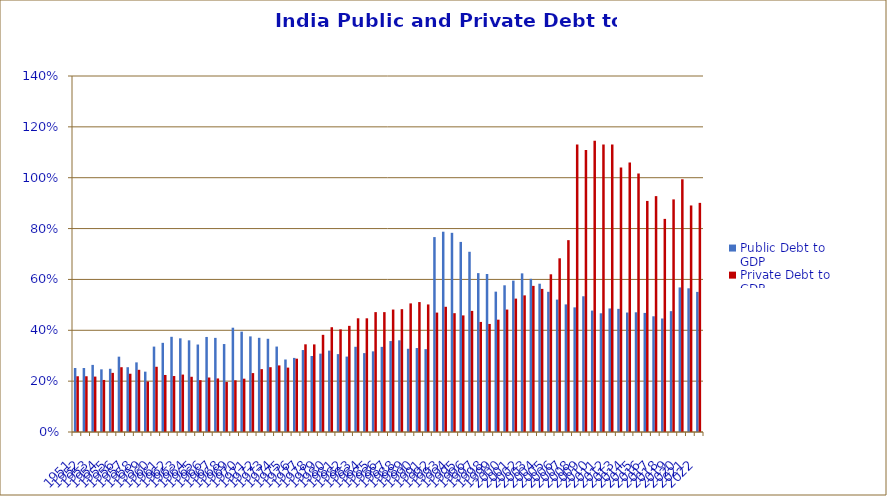
| Category | Public Debt to GDP | Private Debt to GDP |
|---|---|---|
| 1951.0 | 0.252 | 0.219 |
| 1952.0 | 0.252 | 0.219 |
| 1953.0 | 0.264 | 0.218 |
| 1954.0 | 0.246 | 0.205 |
| 1955.0 | 0.249 | 0.232 |
| 1956.0 | 0.296 | 0.255 |
| 1957.0 | 0.255 | 0.229 |
| 1958.0 | 0.274 | 0.245 |
| 1959.0 | 0.237 | 0.199 |
| 1960.0 | 0.336 | 0.257 |
| 1961.0 | 0.351 | 0.224 |
| 1962.0 | 0.374 | 0.22 |
| 1963.0 | 0.368 | 0.226 |
| 1964.0 | 0.36 | 0.217 |
| 1965.0 | 0.344 | 0.204 |
| 1966.0 | 0.374 | 0.214 |
| 1967.0 | 0.37 | 0.211 |
| 1968.0 | 0.346 | 0.197 |
| 1969.0 | 0.41 | 0.203 |
| 1970.0 | 0.395 | 0.21 |
| 1971.0 | 0.376 | 0.232 |
| 1972.0 | 0.37 | 0.247 |
| 1973.0 | 0.367 | 0.255 |
| 1974.0 | 0.336 | 0.262 |
| 1975.0 | 0.285 | 0.253 |
| 1976.0 | 0.291 | 0.288 |
| 1977.0 | 0.322 | 0.345 |
| 1978.0 | 0.299 | 0.345 |
| 1979.0 | 0.308 | 0.382 |
| 1980.0 | 0.32 | 0.412 |
| 1981.0 | 0.306 | 0.404 |
| 1982.0 | 0.297 | 0.417 |
| 1983.0 | 0.335 | 0.447 |
| 1984.0 | 0.31 | 0.447 |
| 1985.0 | 0.317 | 0.471 |
| 1986.0 | 0.335 | 0.471 |
| 1987.0 | 0.358 | 0.482 |
| 1988.0 | 0.361 | 0.483 |
| 1989.0 | 0.327 | 0.506 |
| 1990.0 | 0.33 | 0.511 |
| 1991.0 | 0.326 | 0.502 |
| 1992.0 | 0.767 | 0.47 |
| 1993.0 | 0.788 | 0.492 |
| 1994.0 | 0.783 | 0.467 |
| 1995.0 | 0.748 | 0.458 |
| 1996.0 | 0.709 | 0.476 |
| 1997.0 | 0.625 | 0.433 |
| 1998.0 | 0.621 | 0.425 |
| 1999.0 | 0.552 | 0.442 |
| 2000.0 | 0.577 | 0.482 |
| 2001.0 | 0.595 | 0.525 |
| 2002.0 | 0.624 | 0.537 |
| 2003.0 | 0.603 | 0.575 |
| 2004.0 | 0.583 | 0.563 |
| 2005.0 | 0.551 | 0.62 |
| 2006.0 | 0.521 | 0.683 |
| 2007.0 | 0.502 | 0.754 |
| 2008.0 | 0.49 | 1.131 |
| 2009.0 | 0.534 | 1.109 |
| 2010.0 | 0.478 | 1.146 |
| 2011.0 | 0.467 | 1.13 |
| 2012.0 | 0.486 | 1.131 |
| 2013.0 | 0.484 | 1.04 |
| 2014.0 | 0.47 | 1.059 |
| 2015.0 | 0.471 | 1.016 |
| 2016.0 | 0.468 | 0.909 |
| 2017.0 | 0.455 | 0.928 |
| 2018.0 | 0.446 | 0.838 |
| 2019.0 | 0.475 | 0.915 |
| 2020.0 | 0.568 | 0.994 |
| 2021.0 | 0.565 | 0.891 |
| 2022.0 | 0.551 | 0.901 |